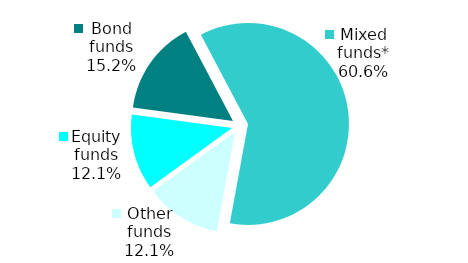
| Category | Series 0 |
|---|---|
| Equity funds | 4 |
| Bond funds | 5 |
| Mixed funds* | 20 |
| Other funds | 4 |